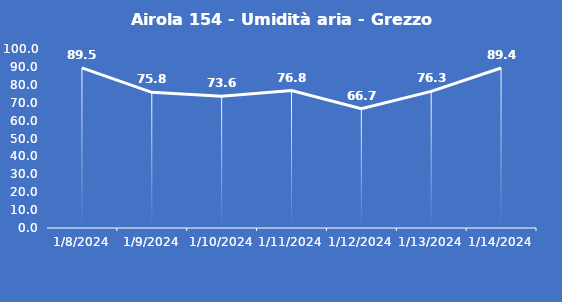
| Category | Airola 154 - Umidità aria - Grezzo (%) |
|---|---|
| 1/8/24 | 89.5 |
| 1/9/24 | 75.8 |
| 1/10/24 | 73.6 |
| 1/11/24 | 76.8 |
| 1/12/24 | 66.7 |
| 1/13/24 | 76.3 |
| 1/14/24 | 89.4 |